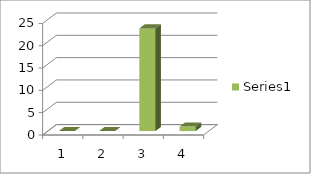
| Category | Series 0 |
|---|---|
| 0 | 0 |
| 1 | 0 |
| 2 | 23 |
| 3 | 1 |